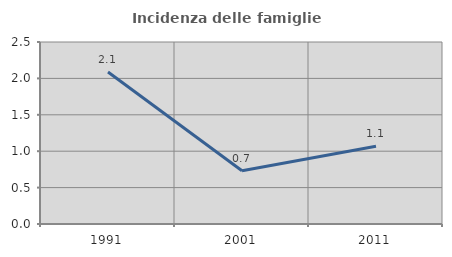
| Category | Incidenza delle famiglie numerose |
|---|---|
| 1991.0 | 2.088 |
| 2001.0 | 0.731 |
| 2011.0 | 1.068 |